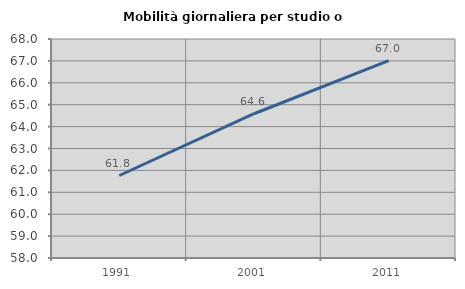
| Category | Mobilità giornaliera per studio o lavoro |
|---|---|
| 1991.0 | 61.767 |
| 2001.0 | 64.588 |
| 2011.0 | 67.015 |